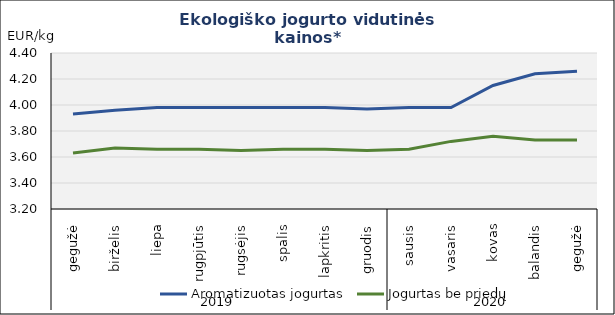
| Category | Aromatizuotas jogurtas | Jogurtas be priedų |
|---|---|---|
| 0 | 3.93 | 3.63 |
| 1 | 3.96 | 3.67 |
| 2 | 3.98 | 3.66 |
| 3 | 3.98 | 3.66 |
| 4 | 3.98 | 3.65 |
| 5 | 3.98 | 3.66 |
| 6 | 3.98 | 3.66 |
| 7 | 3.97 | 3.65 |
| 8 | 3.98 | 3.66 |
| 9 | 3.98 | 3.72 |
| 10 | 4.15 | 3.76 |
| 11 | 4.24 | 3.73 |
| 12 | 4.26 | 3.73 |